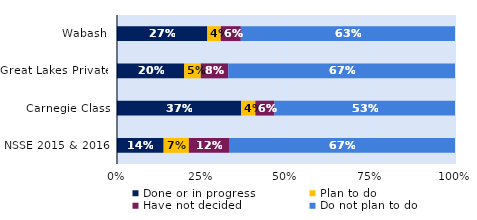
| Category | Done or in progress | Plan to do | Have not decided | Do not plan to do |
|---|---|---|---|---|
| Wabash | 0.267 | 0.04 | 0.059 | 0.634 |
| Great Lakes Private | 0.199 | 0.049 | 0.082 | 0.671 |
| Carnegie Class | 0.367 | 0.042 | 0.057 | 0.534 |
| NSSE 2015 & 2016 | 0.138 | 0.075 | 0.119 | 0.669 |